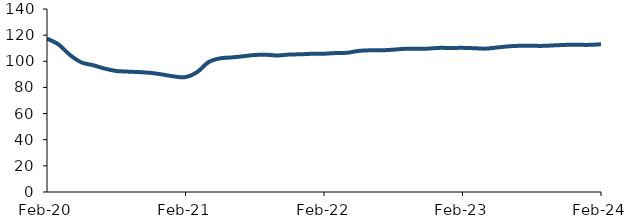
| Category | Series 0 |
|---|---|
| 2020-02-01 | 117.318 |
| 2020-03-01 | 112.843 |
| 2020-04-01 | 104.749 |
| 2020-05-01 | 99.065 |
| 2020-06-01 | 97 |
| 2020-07-01 | 94.403 |
| 2020-08-01 | 92.588 |
| 2020-09-01 | 92.095 |
| 2020-10-01 | 91.72 |
| 2020-11-01 | 91.108 |
| 2020-12-01 | 89.884 |
| 2021-01-01 | 88.42 |
| 2021-02-01 | 87.87 |
| 2021-03-01 | 91.662 |
| 2021-04-01 | 99.36 |
| 2021-05-01 | 102.252 |
| 2021-06-01 | 102.937 |
| 2021-07-01 | 103.85 |
| 2021-08-01 | 104.82 |
| 2021-09-01 | 104.952 |
| 2021-10-01 | 104.465 |
| 2021-11-01 | 105.171 |
| 2021-12-01 | 105.344 |
| 2022-01-01 | 105.752 |
| 2022-02-01 | 105.784 |
| 2022-03-01 | 106.289 |
| 2022-04-01 | 106.52 |
| 2022-05-01 | 107.933 |
| 2022-06-01 | 108.418 |
| 2022-07-01 | 108.373 |
| 2022-08-01 | 108.898 |
| 2022-09-01 | 109.553 |
| 2022-10-01 | 109.61 |
| 2022-11-01 | 109.687 |
| 2022-12-01 | 110.251 |
| 2023-01-01 | 110.176 |
| 2023-02-01 | 110.279 |
| 2023-03-01 | 110.001 |
| 2023-04-01 | 109.685 |
| 2023-05-01 | 110.559 |
| 2023-06-01 | 111.451 |
| 2023-07-01 | 111.863 |
| 2023-08-01 | 111.819 |
| 2023-09-01 | 111.804 |
| 2023-10-01 | 112.194 |
| 2023-11-01 | 112.565 |
| 2023-12-01 | 112.585 |
| 2024-01-01 | 112.572 |
| 2024-02-01 | 113.004 |